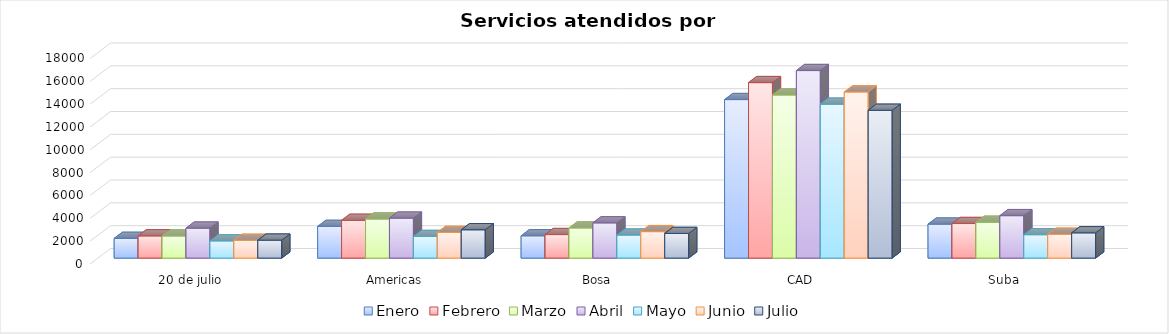
| Category | Enero | Febrero | Marzo | Abril | Mayo | Junio | Julio |
|---|---|---|---|---|---|---|---|
| 20 de julio | 1728 | 1945 | 1938 | 2622 | 1506 | 1559 | 1570 |
| Americas | 2775 | 3308 | 3423 | 3497 | 1894 | 2249 | 2479 |
| Bosa | 1953 | 2061 | 2641 | 3084 | 2016 | 2317 | 2157 |
| CAD | 13884 | 15370 | 14286 | 16426 | 13480 | 14550 | 12945 |
| Suba | 2975 | 3028 | 3141 | 3717 | 2048 | 2088 | 2211 |